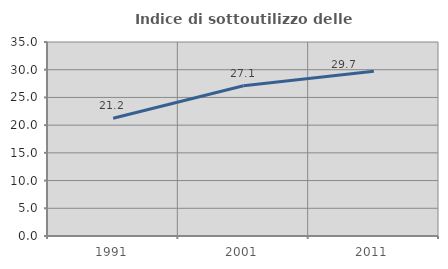
| Category | Indice di sottoutilizzo delle abitazioni  |
|---|---|
| 1991.0 | 21.244 |
| 2001.0 | 27.116 |
| 2011.0 | 29.733 |